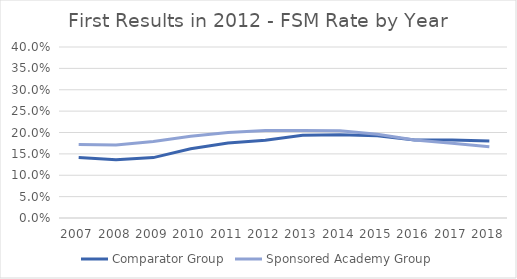
| Category | Comparator Group | Sponsored Academy Group |
|---|---|---|
| 2007.0 | 0.142 | 0.172 |
| 2008.0 | 0.136 | 0.171 |
| 2009.0 | 0.141 | 0.179 |
| 2010.0 | 0.162 | 0.191 |
| 2011.0 | 0.175 | 0.2 |
| 2012.0 | 0.182 | 0.205 |
| 2013.0 | 0.194 | 0.205 |
| 2014.0 | 0.195 | 0.204 |
| 2015.0 | 0.192 | 0.196 |
| 2016.0 | 0.183 | 0.183 |
| 2017.0 | 0.183 | 0.175 |
| 2018.0 | 0.18 | 0.167 |